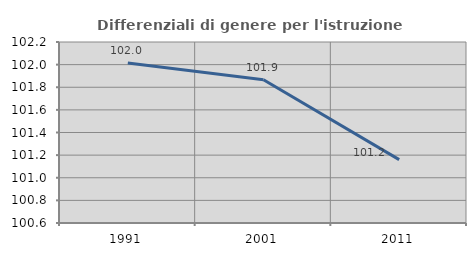
| Category | Differenziali di genere per l'istruzione superiore |
|---|---|
| 1991.0 | 102.014 |
| 2001.0 | 101.866 |
| 2011.0 | 101.16 |